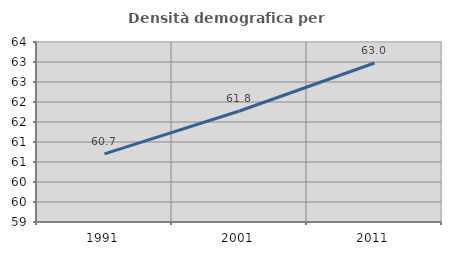
| Category | Densità demografica |
|---|---|
| 1991.0 | 60.704 |
| 2001.0 | 61.774 |
| 2011.0 | 62.975 |